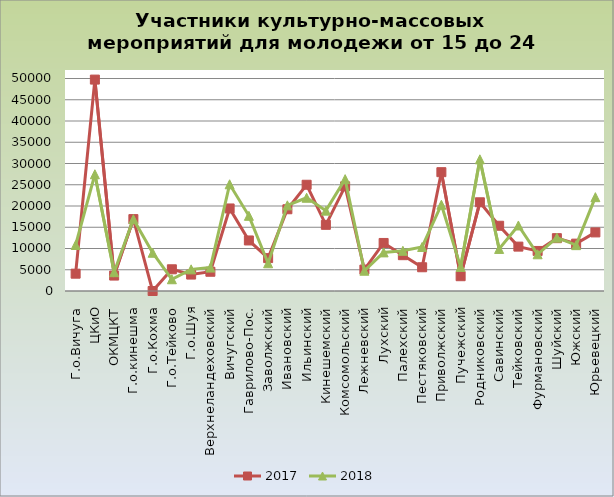
| Category | 2017 | 2018 |
|---|---|---|
| Г.о.Вичуга | 4074 | 10821 |
| ЦКиО | 49742 | 27466 |
| ОКМЦКТ | 3630 | 4425 |
| Г.о.кинешма | 16918 | 16903 |
| Г.о.Кохма | 0 | 9000 |
| Г.о.Тейково | 5110 | 2763 |
| Г.о.Шуя | 3865 | 5090 |
| Верхнеландеховский | 4529 | 5511 |
| Вичугский | 19420 | 25106 |
| Гаврилово-Пос. | 11891 | 17686 |
| Заволжский | 7738 | 6523 |
| Ивановский | 19235 | 20149 |
| Ильинский | 25000 | 21939 |
| Кинешемский | 15572 | 18911 |
| Комсомольский | 24630 | 26320 |
| Лежневский | 5041 | 4765 |
| Лухский | 11305 | 9085 |
| Палехский | 8429 | 9454 |
| Пестяковский | 5587 | 10363 |
| Приволжский | 27958 | 20301 |
| Пучежский | 3479 | 5667 |
| Родниковский | 20873 | 30980 |
| Савинский | 15352 | 9894 |
| Тейковский | 10444 | 15417 |
| Фурмановский | 9421 | 8642 |
| Шуйский | 12431 | 12551 |
| Южский | 11143 | 10788 |
| Юрьевецкий | 13786 | 22078 |